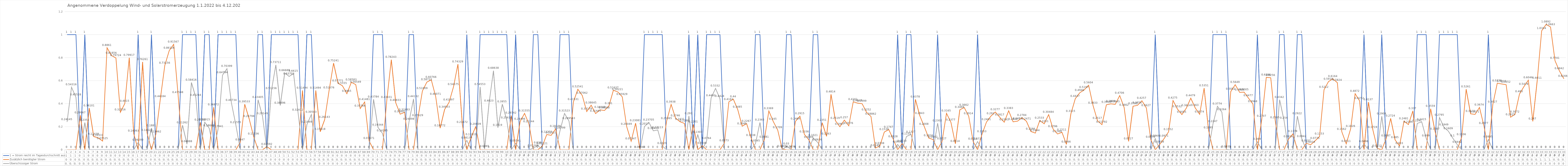
| Category | 1 = Strom reicht im Tagesdurchschnitt aus | Zusätzlich benötigter Strom | Überschüssiger Strom |
|---|---|---|---|
| 0 | 1 | 0 | 0.241 |
| 1 | 1 | 0 | 0.543 |
| 2 | 1 | 0 | 0.455 |
| 3 | 0 | 0.3 | 0 |
| 4 | 1 | 0 | 0.236 |
| 5 | 0 | 0.361 | 0 |
| 6 | 0 | 0.114 | 0 |
| 7 | 0 | 0.103 | 0 |
| 8 | 0 | 0.075 | 0 |
| 9 | 0 | 0.886 | 0 |
| 10 | 0 | 0.819 | 0 |
| 11 | 0 | 0.797 | 0 |
| 12 | 0 | 0.325 | 0 |
| 13 | 0 | 0.402 | 0 |
| 14 | 0 | 0.799 | 0 |
| 15 | 0 | 0.141 | 0 |
| 16 | 1 | 0 | 0.063 |
| 17 | 0 | 0.763 | 0 |
| 18 | 0 | 0.146 | 0 |
| 19 | 1 | 0 | 0.188 |
| 20 | 0 | 0.135 | 0 |
| 21 | 0 | 0.442 | 0 |
| 22 | 0 | 0.732 | 0 |
| 23 | 0 | 0.861 | 0 |
| 24 | 0 | 0.916 | 0 |
| 25 | 0 | 0.475 | 0 |
| 26 | 1 | 0 | 0.213 |
| 27 | 1 | 0 | 0.049 |
| 28 | 1 | 0 | 0.584 |
| 29 | 1 | 0 | 0.452 |
| 30 | 0 | 0.238 | 0 |
| 31 | 1 | 0 | 0.239 |
| 32 | 1 | 0 | 0.187 |
| 33 | 0 | 0.369 | 0 |
| 34 | 1 | 0 | 0.179 |
| 35 | 1 | 0 | 0.648 |
| 36 | 1 | 0 | 0.704 |
| 37 | 1 | 0 | 0.407 |
| 38 | 1 | 0 | 0.216 |
| 39 | 0 | 0.065 | 0 |
| 40 | 0 | 0.395 | 0 |
| 41 | 0 | 0.268 | 0 |
| 42 | 0 | 0.115 | 0 |
| 43 | 1 | 0 | 0.434 |
| 44 | 1 | 0 | 0.291 |
| 45 | 0 | 0.026 | 0 |
| 46 | 1 | 0 | 0.512 |
| 47 | 1 | 0 | 0.737 |
| 48 | 1 | 0 | 0.385 |
| 49 | 1 | 0 | 0.667 |
| 50 | 1 | 0 | 0.637 |
| 51 | 1 | 0 | 0.661 |
| 52 | 1 | 0 | 0.324 |
| 53 | 0 | 0.515 | 0 |
| 54 | 1 | 0 | 0.219 |
| 55 | 1 | 0 | 0.306 |
| 56 | 0 | 0.515 | 0 |
| 57 | 0 | 0.156 | 0 |
| 58 | 0 | 0.261 | 0 |
| 59 | 0 | 0.517 | 0 |
| 60 | 0 | 0.752 | 0 |
| 61 | 0 | 0.578 | 0 |
| 62 | 0 | 0.556 | 0 |
| 63 | 0 | 0.487 | 0 |
| 64 | 0 | 0.586 | 0 |
| 65 | 0 | 0.565 | 0 |
| 66 | 0 | 0.358 | 0 |
| 67 | 0 | 0.415 | 0 |
| 68 | 0 | 0.077 | 0 |
| 69 | 1 | 0 | 0.438 |
| 70 | 1 | 0 | 0.193 |
| 71 | 1 | 0 | 0.143 |
| 72 | 0 | 0.434 | 0 |
| 73 | 0 | 0.782 | 0 |
| 74 | 0 | 0.408 | 0 |
| 75 | 0 | 0.309 | 0 |
| 76 | 0 | 0.325 | 0 |
| 77 | 1 | 0 | 0.245 |
| 78 | 1 | 0 | 0.441 |
| 79 | 0 | 0.276 | 0 |
| 80 | 0 | 0.51 | 0 |
| 81 | 0 | 0.587 | 0 |
| 82 | 0 | 0.608 | 0 |
| 83 | 0 | 0.461 | 0 |
| 84 | 0 | 0.188 | 0 |
| 85 | 0 | 0.349 | 0 |
| 86 | 0 | 0.411 | 0 |
| 87 | 0 | 0.546 | 0 |
| 88 | 0 | 0.743 | 0 |
| 89 | 0 | 0.217 | 0 |
| 90 | 1 | 0 | 0.081 |
| 91 | 0 | 0.11 | 0 |
| 92 | 0 | 0.2 | 0 |
| 93 | 1 | 0 | 0.546 |
| 94 | 1 | 0 | 0.006 |
| 95 | 1 | 0 | 0.402 |
| 96 | 1 | 0 | 0.686 |
| 97 | 1 | 0 | 0.192 |
| 98 | 1 | 0 | 0.396 |
| 99 | 1 | 0 | 0.256 |
| 100 | 0 | 0.297 | 0 |
| 101 | 1 | 0 | 0.055 |
| 102 | 0 | 0.245 | 0 |
| 103 | 0 | 0.316 | 0 |
| 104 | 0 | 0.222 | 0 |
| 105 | 1 | 0 | 0.013 |
| 106 | 1 | 0 | 0.038 |
| 107 | 0 | 0.031 | 0 |
| 108 | 0 | 0.132 | 0 |
| 109 | 0 | 0.125 | 0 |
| 110 | 0 | 0.181 | 0 |
| 111 | 1 | 0 | 0.168 |
| 112 | 1 | 0 | 0.315 |
| 113 | 1 | 0 | 0.25 |
| 114 | 0 | 0.415 | 0 |
| 115 | 0 | 0.525 | 0 |
| 116 | 0 | 0.471 | 0 |
| 117 | 0 | 0.332 | 0 |
| 118 | 0 | 0.386 | 0 |
| 119 | 0 | 0.314 | 0 |
| 120 | 0 | 0.346 | 0 |
| 121 | 0 | 0.341 | 0 |
| 122 | 0 | 0.381 | 0 |
| 123 | 0 | 0.516 | 0 |
| 124 | 0 | 0.502 | 0 |
| 125 | 0 | 0.459 | 0 |
| 126 | 0 | 0.2 | 0 |
| 127 | 0 | 0.073 | 0 |
| 128 | 0 | 0.231 | 0 |
| 129 | 0 | 0 | 0 |
| 130 | 1 | 0 | 0.202 |
| 131 | 1 | 0 | 0.237 |
| 132 | 1 | 0 | 0.164 |
| 133 | 1 | 0 | 0.171 |
| 134 | 1 | 0 | 0.033 |
| 135 | 0 | 0.251 | 0 |
| 136 | 0 | 0.394 | 0 |
| 137 | 0 | 0.275 | 0 |
| 138 | 0 | 0.243 | 0 |
| 139 | 0 | 0.229 | 0 |
| 140 | 1 | 0 | 0.293 |
| 141 | 0 | 0.22 | 0 |
| 142 | 1 | 0 | 0.13 |
| 143 | 0 | 0.035 | 0 |
| 144 | 1 | 0 | 0.076 |
| 145 | 1 | 0 | 0.449 |
| 146 | 1 | 0 | 0.533 |
| 147 | 1 | 0 | 0.442 |
| 148 | 0 | 0.057 | 0 |
| 149 | 0 | 0.416 | 0 |
| 150 | 0 | 0.44 | 0 |
| 151 | 0 | 0.348 | 0 |
| 152 | 0 | 0.205 | 0 |
| 153 | 0 | 0.227 | 0 |
| 154 | 0 | 0.104 | 0 |
| 155 | 1 | 0 | 0.054 |
| 156 | 1 | 0 | 0.237 |
| 157 | 0 | 0.088 | 0 |
| 158 | 0 | 0.337 | 0 |
| 159 | 0 | 0.245 | 0 |
| 160 | 0 | 0.171 | 0 |
| 161 | 0 | 0.007 | 0 |
| 162 | 1 | 0 | 0.03 |
| 163 | 1 | 0 | 0.004 |
| 164 | 0 | 0.247 | 0 |
| 165 | 0 | 0.292 | 0 |
| 166 | 0 | 0.134 | 0 |
| 167 | 0 | 0.087 | 0 |
| 168 | 1 | 0 | 0.102 |
| 169 | 1 | 0 | 0.064 |
| 170 | 0 | 0.235 | 0 |
| 171 | 0 | 0.116 | 0 |
| 172 | 0 | 0.481 | 0 |
| 173 | 0 | 0.252 | 0 |
| 174 | 0 | 0.2 | 0 |
| 175 | 0 | 0.257 | 0 |
| 176 | 0 | 0.208 | 0 |
| 177 | 0 | 0.416 | 0 |
| 178 | 0 | 0.405 | 0 |
| 179 | 0 | 0.4 | 0 |
| 180 | 0 | 0.325 | 0 |
| 181 | 0 | 0.289 | 0 |
| 182 | 0 | 0.015 | 0 |
| 183 | 0 | 0.034 | 0 |
| 184 | 0 | 0.154 | 0 |
| 185 | 0 | 0.175 | 0 |
| 186 | 0 | 0.093 | 0 |
| 187 | 1 | 0 | 0.046 |
| 188 | 0 | 0.053 | 0 |
| 189 | 1 | 0 | 0.115 |
| 190 | 1 | 0 | 0.133 |
| 191 | 0 | 0.438 | 0 |
| 192 | 0 | 0.294 | 0 |
| 193 | 0 | 0.201 | 0 |
| 194 | 0 | 0.102 | 0 |
| 195 | 0 | 0.088 | 0 |
| 196 | 1 | 0 | 0.23 |
| 197 | 0 | 0.073 | 0 |
| 198 | 0 | 0.316 | 0 |
| 199 | 0 | 0.238 | 0 |
| 200 | 0 | 0.051 | 0 |
| 201 | 0 | 0.347 | 0 |
| 202 | 0 | 0.366 | 0 |
| 203 | 0 | 0.291 | 0 |
| 204 | 0 | 0.071 | 0 |
| 205 | 1 | 0 | 0.071 |
| 206 | 0 | 0.135 | 0 |
| 207 | 0 | 0.24 | 0 |
| 208 | 0 | 0.292 | 0 |
| 209 | 0 | 0.328 | 0 |
| 210 | 0 | 0.282 | 0 |
| 211 | 0 | 0.239 | 0 |
| 212 | 0 | 0.338 | 0 |
| 213 | 0 | 0.243 | 0 |
| 214 | 0 | 0.248 | 0 |
| 215 | 0 | 0.278 | 0 |
| 216 | 0 | 0.247 | 0 |
| 217 | 0 | 0.159 | 0 |
| 218 | 0 | 0.144 | 0 |
| 219 | 0 | 0.253 | 0 |
| 220 | 0 | 0.225 | 0 |
| 221 | 0 | 0.305 | 0 |
| 222 | 0 | 0.18 | 0 |
| 223 | 0 | 0.137 | 0 |
| 224 | 0 | 0.151 | 0 |
| 225 | 0 | 0.047 | 0 |
| 226 | 0 | 0.311 | 0 |
| 227 | 0 | 0.444 | 0 |
| 228 | 0 | 0.495 | 0 |
| 229 | 0 | 0.52 | 0 |
| 230 | 0 | 0.56 | 0 |
| 231 | 0 | 0.383 | 0 |
| 232 | 0 | 0.252 | 0 |
| 233 | 0 | 0.218 | 0 |
| 234 | 0 | 0.391 | 0 |
| 235 | 0 | 0.399 | 0 |
| 236 | 0 | 0.394 | 0 |
| 237 | 0 | 0.471 | 0 |
| 238 | 0 | 0.366 | 0 |
| 239 | 0 | 0.073 | 0 |
| 240 | 0 | 0.378 | 0 |
| 241 | 0 | 0.386 | 0 |
| 242 | 0 | 0.426 | 0 |
| 243 | 0 | 0.363 | 0 |
| 244 | 0 | 0.088 | 0 |
| 245 | 1 | 0 | 0.097 |
| 246 | 0 | 0.046 | 0 |
| 247 | 0 | 0.097 | 0 |
| 248 | 0 | 0.155 | 0 |
| 249 | 0 | 0.428 | 0 |
| 250 | 0 | 0.353 | 0 |
| 251 | 0 | 0.305 | 0 |
| 252 | 0 | 0.361 | 0 |
| 253 | 0 | 0.448 | 0 |
| 254 | 0 | 0.363 | 0 |
| 255 | 0 | 0.307 | 0 |
| 256 | 0 | 0.535 | 0 |
| 257 | 0 | 0.169 | 0 |
| 258 | 1 | 0 | 0.225 |
| 259 | 1 | 0 | 0.377 |
| 260 | 1 | 0 | 0.326 |
| 261 | 1 | 0 | 0.003 |
| 262 | 0 | 0.505 | 0 |
| 263 | 0 | 0.565 | 0 |
| 264 | 0 | 0.499 | 0 |
| 265 | 0 | 0.5 | 0 |
| 266 | 0 | 0.448 | 0 |
| 267 | 0 | 0.397 | 0 |
| 268 | 1 | 0 | 0.069 |
| 269 | 0 | 0.271 | 0 |
| 270 | 0 | 0.629 | 0 |
| 271 | 0 | 0.626 | 0 |
| 272 | 0 | 0.257 | 0 |
| 273 | 1 | 0 | 0.434 |
| 274 | 1 | 0 | 0.254 |
| 275 | 0 | 0.092 | 0 |
| 276 | 0 | 0.138 | 0 |
| 277 | 1 | 0 | 0.292 |
| 278 | 1 | 0 | 0.094 |
| 279 | 0 | 0.056 | 0 |
| 280 | 0 | 0.043 | 0 |
| 281 | 0 | 0.077 | 0 |
| 282 | 0 | 0.115 | 0 |
| 283 | 0 | 0.521 | 0 |
| 284 | 0 | 0.592 | 0 |
| 285 | 0 | 0.616 | 0 |
| 286 | 0 | 0.582 | 0 |
| 287 | 0 | 0.156 | 0 |
| 288 | 0 | 0.051 | 0 |
| 289 | 0 | 0.183 | 0 |
| 290 | 0 | 0.487 | 0 |
| 291 | 0 | 0.425 | 0 |
| 292 | 1 | 0 | 0.05 |
| 293 | 0 | 0.414 | 0 |
| 294 | 0 | 0.172 | 0 |
| 295 | 0 | 0.011 | 0 |
| 296 | 1 | 0 | 0.291 |
| 297 | 0 | 0.099 | 0 |
| 298 | 0 | 0.272 | 0 |
| 299 | 0 | 0.085 | 0 |
| 300 | 0 | 0.033 | 0 |
| 301 | 0 | 0.248 | 0 |
| 302 | 0 | 0.219 | 0 |
| 303 | 0 | 0.337 | 0 |
| 304 | 1 | 0 | 0.229 |
| 305 | 1 | 0 | 0.242 |
| 306 | 1 | 0 | 0.099 |
| 307 | 0 | 0.356 | 0 |
| 308 | 0 | 0.159 | 0 |
| 309 | 1 | 0 | 0.279 |
| 310 | 1 | 0 | 0.195 |
| 311 | 1 | 0 | 0.161 |
| 312 | 1 | 0 | 0.1 |
| 313 | 1 | 0 | 0.044 |
| 314 | 0 | 0.111 | 0 |
| 315 | 0 | 0.526 | 0 |
| 316 | 0 | 0.312 | 0 |
| 317 | 0 | 0.307 | 0 |
| 318 | 0 | 0.367 | 0 |
| 319 | 0 | 0.208 | 0 |
| 320 | 1 | 0 | 0.089 |
| 321 | 0 | 0.393 | 0 |
| 322 | 0 | 0.578 | 0 |
| 323 | 0 | 0.572 | 0 |
| 324 | 0 | 0.565 | 0 |
| 325 | 0 | 0.283 | 0 |
| 326 | 0 | 0.307 | 0 |
| 327 | 0 | 0.483 | 0 |
| 328 | 0 | 0.548 | 0 |
| 329 | 0 | 0.605 | 0 |
| 330 | 0 | 0.247 | 0 |
| 331 | 0 | 0.601 | 0 |
| 332 | 0 | 1.033 | 0 |
| 333 | 0 | 1.089 | 0 |
| 334 | 0 | 1.066 | 0 |
| 335 | 0 | 0.774 | 0 |
| 336 | 0 | 0.684 | 0 |
| 337 | 0 | 0.617 | 0 |